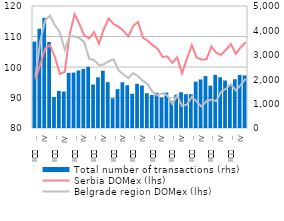
| Category | Total number of transactions (rhs) |
|---|---|
| I | 3540 |
| II
     2008 | 4071 |
| III | 4515 |
| IV | 3524 |
| I
2009 | 1271 |
| II
     2009 | 1521 |
| III | 1495 |
| IV
 | 2262 |
| I
2010 | 2272 |
| II
     2010 | 2357 |
| III | 2422 |
| IV | 2508 |
| I
2011. | 1782 |
| II
     2011 | 2078 |
| III | 2347 |
| IV | 1877 |
| I
2012. | 1218 |
| II
     2012 | 1592 |
| III | 1875 |
| IV | 1752 |
| I
2013. | 1403 |
| II
     2013 | 1813 |
| III | 1741 |
| IV | 1424 |
| I
2014. | 1351 |
| II
     2014 | 1443 |
| III | 1247 |
| IV | 1451 |
| I
2015. | 1113 |
| II
     2015 | 1363 |
| III | 1466 |
| IV | 1385 |
| I
2016 | 1384 |
| II
     2016 | 1897 |
| III | 1989 |
| IV | 2128 |
| I
2017. | 1735 |
| II
     2017 | 2181 |
| III | 2081 |
| IV | 1948 |
| I
2018. | 1765 |
| II
     2018 | 1999 |
| III | 2171 |
| IV | 2154 |